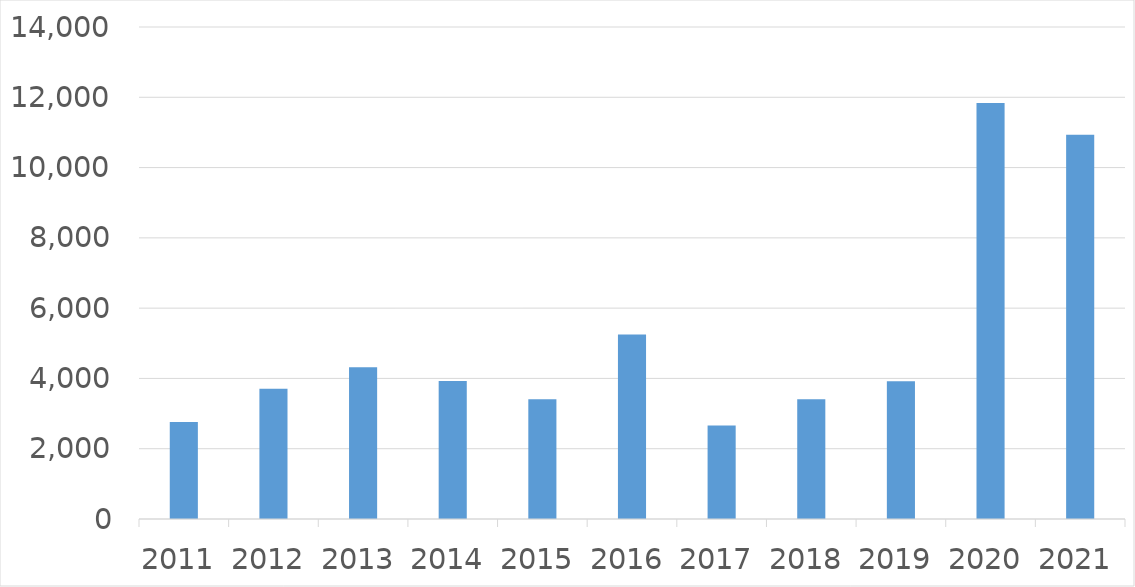
| Category | Series 0 |
|---|---|
| 2011 | 2759 |
| 2012 | 3706 |
| 2013 | 4321 |
| 2014 | 3928 |
| 2015 | 3405 |
| 2016 | 5249 |
| 2017 | 2664 |
| 2018 | 3410 |
| 2019 | 3923 |
| 2020 | 11835 |
| 2021 | 10937 |